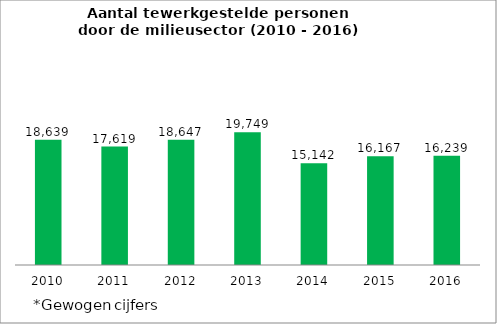
| Category | Aantal tewerkgestelde personen |
|---|---|
| 2010 | 18639 |
| 2011 | 17619 |
| 2012 | 18647 |
| 2013 | 19749 |
| 2014 | 15142.36 |
| 2015 | 16167 |
| 2016 | 16239 |